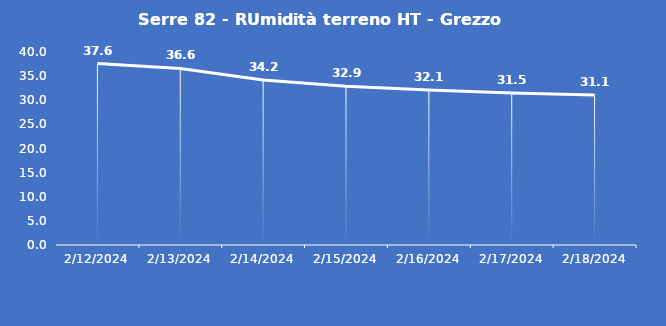
| Category | Serre 82 - RUmidità terreno HT - Grezzo (%VWC) |
|---|---|
| 2/12/24 | 37.6 |
| 2/13/24 | 36.6 |
| 2/14/24 | 34.2 |
| 2/15/24 | 32.9 |
| 2/16/24 | 32.1 |
| 2/17/24 | 31.5 |
| 2/18/24 | 31.1 |